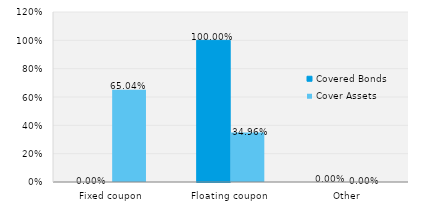
| Category | Covered Bonds | Cover Assets |
|---|---|---|
| Fixed coupon | 0 | 0.65 |
| Floating coupon | 1 | 0.35 |
| Other | 0 | 0 |